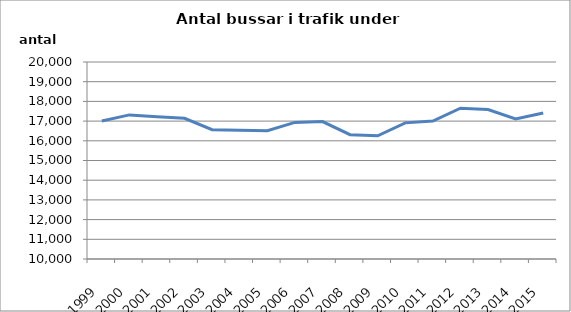
| Category | Series 0 |
|---|---|
| 1999.0 | 17007 |
| 2000.0 | 17315 |
| 2001.0 | 17215 |
| 2002.0 | 17142 |
| 2003.0 | 16564 |
| 2004.0 | 16533 |
| 2005.0 | 16509 |
| 2006.0 | 16934 |
| 2007.0 | 16975 |
| 2008.0 | 16311 |
| 2009.0 | 16253 |
| 2010.0 | 16910 |
| 2011.0 | 17005 |
| 2012.0 | 17655 |
| 2013.0 | 17586 |
| 2014.0 | 17105 |
| 2015.0 | 17413 |